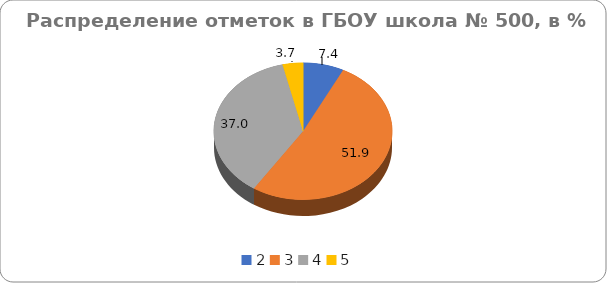
| Category | ГБОУ СОШ №500 |
|---|---|
| 2.0 | 7.41 |
| 3.0 | 51.85 |
| 4.0 | 37.04 |
| 5.0 | 3.7 |